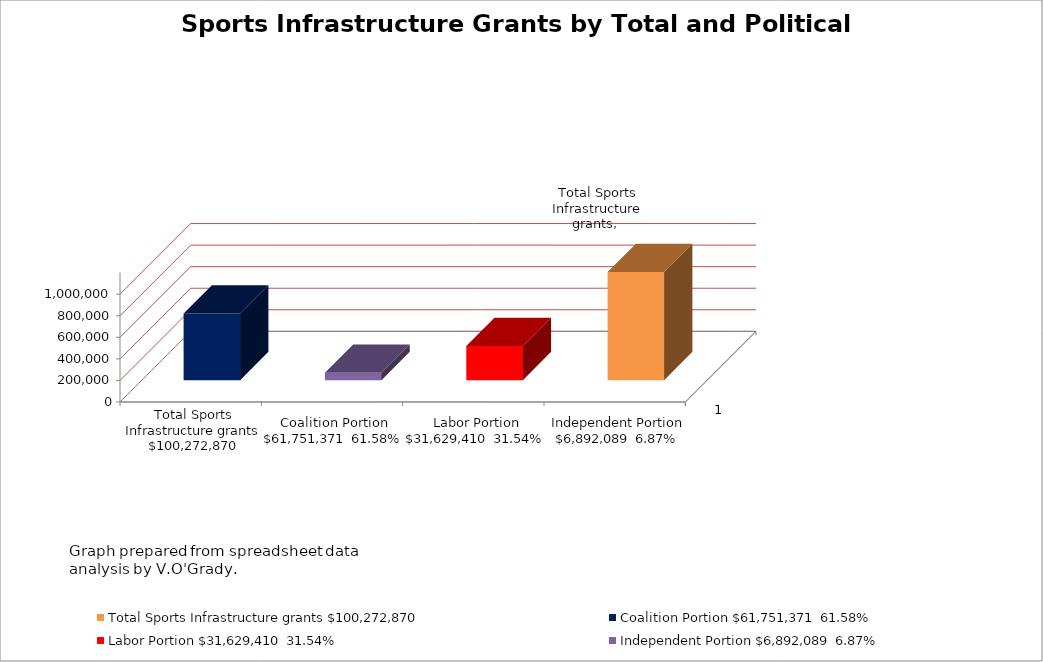
| Category | Total Sports Infrastructure grants $100,272,870 | Coalition Portion $61,751,371  61.58% | Labor Portion $31,629,410  31.54%  | Independent Portion $6,892,089  6.87% |
|---|---|---|---|---|
| 0 | 100272870 | 61751371 | 31629410 | 6892089 |